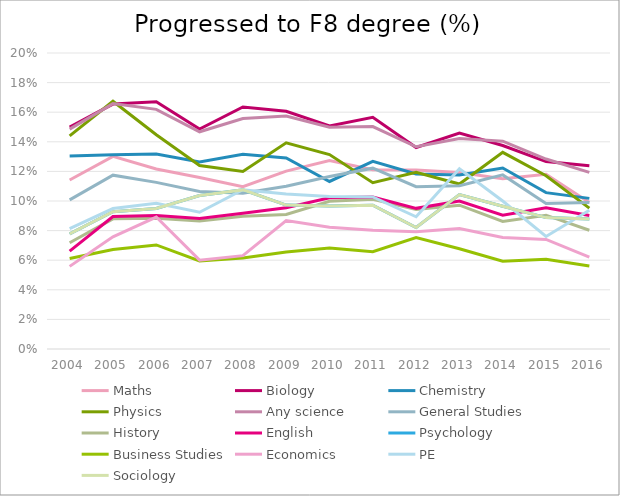
| Category | Maths | Biology | Chemistry | Physics | Any science | General Studies | History | English | Psychology | Business Studies | Economics | PE | Sociology |
|---|---|---|---|---|---|---|---|---|---|---|---|---|---|
| 2004.0 | 0.114 | 0.15 | 0.13 | 0.144 | 0.149 | 0.101 | 0.072 | 0.066 | 0.078 | 0.061 | 0.056 | 0.081 | 0.078 |
| 2005.0 | 0.13 | 0.165 | 0.131 | 0.167 | 0.166 | 0.117 | 0.088 | 0.09 | 0.093 | 0.067 | 0.076 | 0.095 | 0.093 |
| 2006.0 | 0.122 | 0.167 | 0.132 | 0.145 | 0.162 | 0.113 | 0.088 | 0.09 | 0.095 | 0.07 | 0.089 | 0.098 | 0.095 |
| 2007.0 | 0.116 | 0.149 | 0.126 | 0.124 | 0.147 | 0.106 | 0.087 | 0.088 | 0.104 | 0.059 | 0.06 | 0.092 | 0.104 |
| 2008.0 | 0.11 | 0.164 | 0.132 | 0.12 | 0.156 | 0.105 | 0.09 | 0.092 | 0.107 | 0.061 | 0.063 | 0.108 | 0.107 |
| 2009.0 | 0.12 | 0.161 | 0.129 | 0.139 | 0.157 | 0.11 | 0.091 | 0.095 | 0.097 | 0.066 | 0.087 | 0.105 | 0.097 |
| 2010.0 | 0.127 | 0.151 | 0.113 | 0.131 | 0.15 | 0.117 | 0.1 | 0.102 | 0.097 | 0.068 | 0.082 | 0.103 | 0.097 |
| 2011.0 | 0.121 | 0.157 | 0.127 | 0.112 | 0.15 | 0.122 | 0.101 | 0.103 | 0.097 | 0.066 | 0.08 | 0.103 | 0.097 |
| 2012.0 | 0.121 | 0.136 | 0.118 | 0.119 | 0.137 | 0.11 | 0.094 | 0.095 | 0.082 | 0.075 | 0.079 | 0.089 | 0.082 |
| 2013.0 | 0.119 | 0.146 | 0.118 | 0.111 | 0.142 | 0.11 | 0.097 | 0.1 | 0.104 | 0.068 | 0.081 | 0.122 | 0.104 |
| 2014.0 | 0.115 | 0.138 | 0.122 | 0.133 | 0.14 | 0.118 | 0.086 | 0.09 | 0.096 | 0.059 | 0.075 | 0.1 | 0.096 |
| 2015.0 | 0.118 | 0.127 | 0.106 | 0.117 | 0.128 | 0.098 | 0.09 | 0.095 | 0.089 | 0.061 | 0.074 | 0.076 | 0.089 |
| 2016.0 | 0.099 | 0.124 | 0.102 | 0.095 | 0.119 | 0.099 | 0.08 | 0.09 | 0.088 | 0.056 | 0.062 | 0.094 | 0.088 |